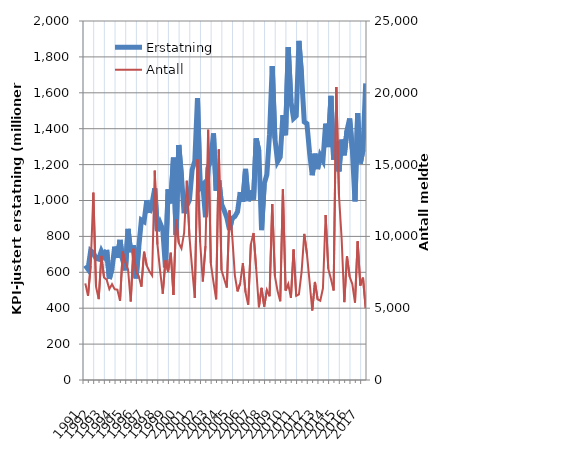
| Category | Erstatning |
|---|---|
| 1991.0 | 638.305 |
| nan | 617.49 |
| nan | 720.489 |
| nan | 708.243 |
| 1992.0 | 677.664 |
| nan | 673.336 |
| nan | 718.939 |
| nan | 690.111 |
| 1993.0 | 724.645 |
| nan | 562.774 |
| nan | 620.914 |
| nan | 743.095 |
| 1994.0 | 680.401 |
| nan | 780.53 |
| nan | 668.973 |
| nan | 610.787 |
| 1995.0 | 841.824 |
| nan | 711.536 |
| nan | 750.775 |
| nan | 566.189 |
| 1996.0 | 737.681 |
| nan | 891.182 |
| nan | 882.294 |
| nan | 1001.12 |
| 1997.0 | 931.155 |
| nan | 984.699 |
| nan | 1067.548 |
| nan | 829.951 |
| 1998.0 | 874.341 |
| nan | 837.865 |
| nan | 627.95 |
| nan | 1062.058 |
| 1999.0 | 984.04 |
| nan | 1239.159 |
| nan | 807.292 |
| nan | 1308.796 |
| 2000.0 | 1135.005 |
| nan | 928.869 |
| nan | 971.109 |
| nan | 1002.211 |
| 2001.0 | 1171.491 |
| nan | 1219.438 |
| nan | 1570.162 |
| nan | 1070.081 |
| 2002.0 | 1086.861 |
| nan | 907.106 |
| nan | 1183.634 |
| nan | 1224.277 |
| 2003.0 | 1373.705 |
| nan | 1054.474 |
| nan | 1113.11 |
| nan | 980.293 |
| 2004.0 | 945.444 |
| nan | 904.425 |
| nan | 836.38 |
| nan | 901.062 |
| 2005.0 | 910.826 |
| nan | 937.052 |
| nan | 1046.812 |
| nan | 993.378 |
| 2006.0 | 1176.283 |
| nan | 996.283 |
| nan | 1056.559 |
| nan | 1005.082 |
| 2007.0 | 1345.962 |
| nan | 1275.048 |
| nan | 835.366 |
| nan | 1092.832 |
| 2008.0 | 1144.621 |
| nan | 1369.428 |
| nan | 1748.539 |
| nan | 1346.977 |
| 2009.0 | 1216.204 |
| nan | 1241.686 |
| nan | 1475.828 |
| nan | 1363.591 |
| 2010.0 | 1854.723 |
| nan | 1552.135 |
| nan | 1457.291 |
| nan | 1471.348 |
| 2011.0 | 1889.184 |
| nan | 1694.934 |
| nan | 1438.377 |
| nan | 1427.875 |
| 2012.0 | 1264.734 |
| nan | 1141.025 |
| nan | 1260.942 |
| nan | 1174.868 |
| 2013.0 | 1250.053 |
| nan | 1222.343 |
| nan | 1427.919 |
| nan | 1297.809 |
| 2014.0 | 1583.326 |
| nan | 1227.429 |
| nan | 1331.604 |
| nan | 1162.233 |
| 2015.0 | 1339.019 |
| nan | 1251.691 |
| nan | 1390.064 |
| nan | 1456.52 |
| 2016.0 | 1285.825 |
| nan | 994.954 |
| nan | 1487.318 |
| nan | 1206.287 |
| 2017.0 | 1282.089 |
| nan | 1652.148 |